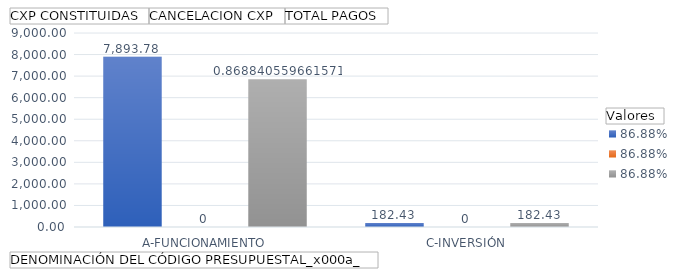
| Category | CXP CONSTITUIDAS | CANCELACION CXP | TOTAL PAGOS |
|---|---|---|---|
| A-FUNCIONAMIENTO | 7893.785 | 0 | 6858.44 |
| C-INVERSIÓN | 182.429 | 0 | 182.429 |